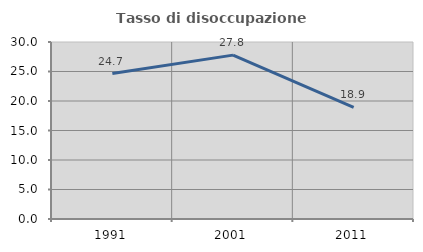
| Category | Tasso di disoccupazione giovanile  |
|---|---|
| 1991.0 | 24.658 |
| 2001.0 | 27.778 |
| 2011.0 | 18.919 |